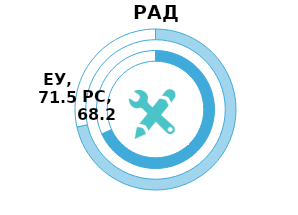
| Category | РС | Series 1 | ЕУ |
|---|---|---|---|
| Index | 68.2 |  | 71.5 |
| Rest | 31.8 |  | 28.5 |